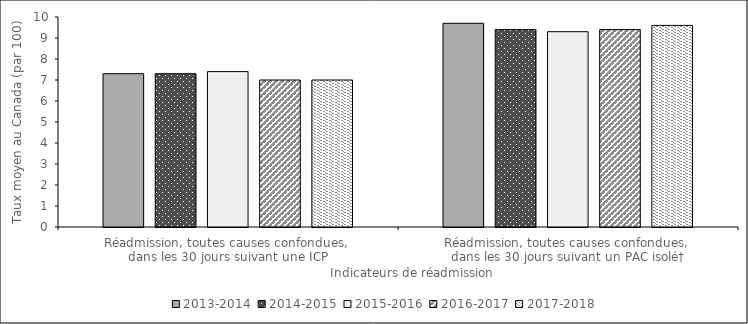
| Category | 2013-2014 | 2014-2015 | 2015-2016 | 2016-2017 | 2017-2018 |
|---|---|---|---|---|---|
| Réadmission, toutes causes confondues, 
dans les 30 jours suivant une ICP | 7.3 | 7.3 | 7.4 | 7 | 7 |
| Réadmission, toutes causes confondues, 
dans les 30 jours suivant un PAC isolé† | 9.7 | 9.4 | 9.3 | 9.4 | 9.6 |